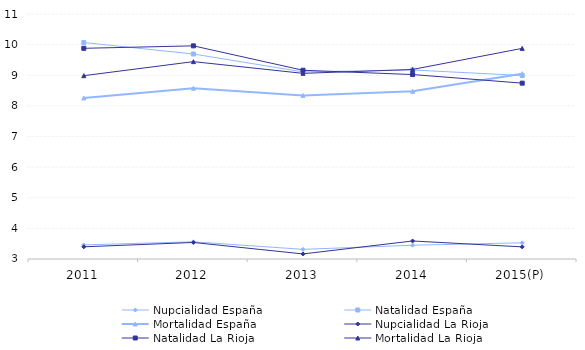
| Category | Nupcialidad España | Natalidad España | Mortalidad España | Nupcialidad La Rioja | Natalidad La Rioja | Mortalidad La Rioja |
|---|---|---|---|---|---|---|
| 2011 | 3.46 | 10.068 | 8.259 | 3.398 | 9.88 | 8.986 |
| 2012 | 3.562 | 9.694 | 8.577 | 3.54 | 9.96 | 9.444 |
| 2013 | 3.315 | 9.109 | 8.34 | 3.166 | 9.163 | 9.062 |
| 2014 | 3.45 | 9.172 | 8.476 | 3.588 | 9.023 | 9.189 |
| 2015(P) | 3.529 | 8.991 | 9.051 | 3.396 | 8.742 | 9.877 |